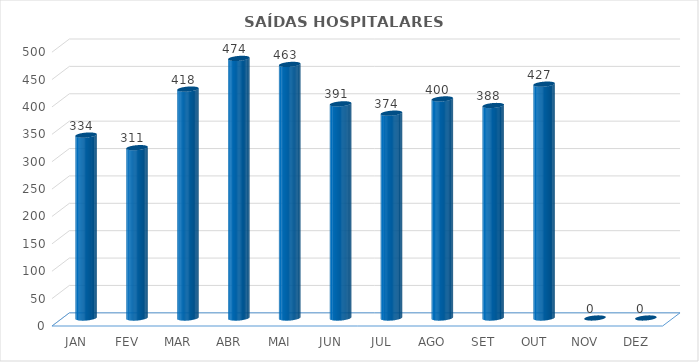
| Category | Series 0 |
|---|---|
| JAN | 334 |
| FEV | 311 |
| MAR | 418 |
| ABR | 474 |
| MAI | 463 |
| JUN | 391 |
| JUL | 374 |
| AGO | 400 |
| SET | 388 |
| OUT | 427 |
| NOV | 0 |
| DEZ | 0 |